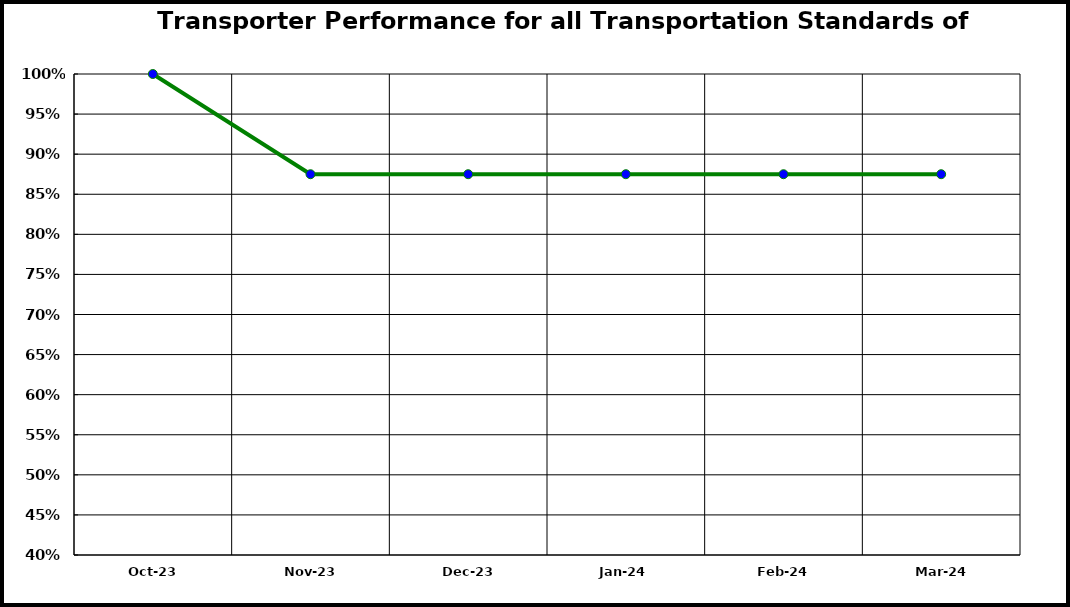
| Category | Performance |
|---|---|
| 2023-10-01 | 1 |
| 2023-11-01 | 0.875 |
| 2023-12-01 | 0.875 |
| 2024-01-01 | 0.875 |
| 2024-02-01 | 0.875 |
| 2024-03-01 | 0.875 |